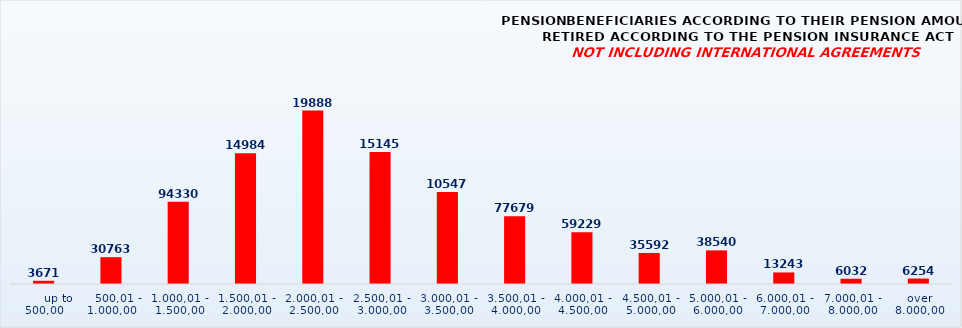
| Category | PENSION BENEFICIARIES ACCORDING TO TYPES AND AMOUNTS OF PENSION, RETIRED ACCORDING TO THE PENSION INSURANCE ACT
NOT INCLUDING INTERNATIONAL AGREEMENTS |
|---|---|
|       up to 500,00 | 3671 |
|    500,01 - 1.000,00 | 30763 |
| 1.000,01 - 1.500,00 | 94330 |
| 1.500,01 - 2.000,00 | 149846 |
| 2.000,01 - 2.500,00 | 198885 |
| 2.500,01 - 3.000,00 | 151453 |
| 3.000,01 - 3.500,00 | 105479 |
| 3.500,01 - 4.000,00 | 77679 |
| 4.000,01 - 4.500,00 | 59229 |
| 4.500,01 - 5.000,00 | 35592 |
| 5.000,01 - 6.000,00 | 38540 |
| 6.000,01 - 7.000,00 | 13243 |
| 7.000,01 - 8.000,00 | 6032 |
|  over  8.000,00 | 6254 |